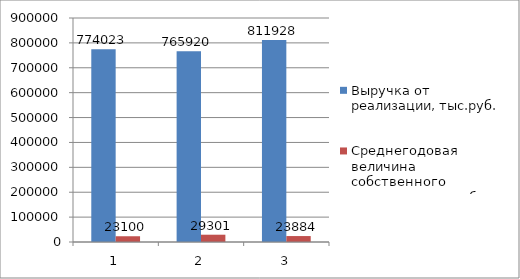
| Category | Выручка от реализации, тыс.руб. | Среднегодовая величина собственного капитала, тыс.руб. |
|---|---|---|
| 0 | 774023 | 23100 |
| 1 | 765920 | 29301 |
| 2 | 811928 | 23884 |